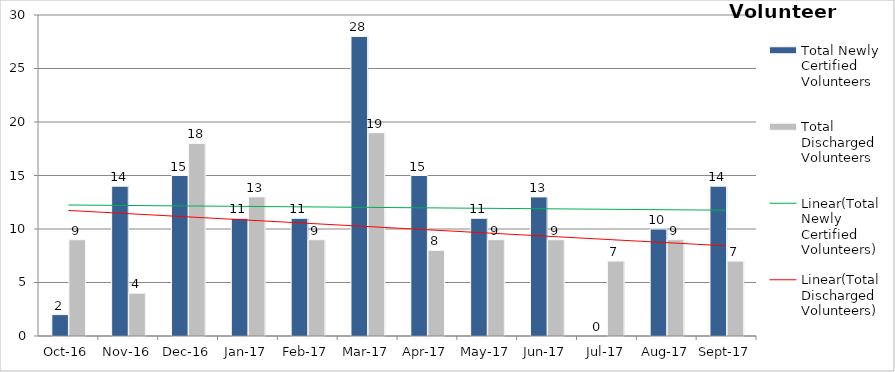
| Category | Total Newly Certified Volunteers | Total Discharged Volunteers |
|---|---|---|
| 2016-10-01 | 2 | 9 |
| 2016-11-01 | 14 | 4 |
| 2016-12-01 | 15 | 18 |
| 2017-01-01 | 11 | 13 |
| 2017-02-01 | 11 | 9 |
| 2017-03-01 | 28 | 19 |
| 2017-04-01 | 15 | 8 |
| 2017-05-01 | 11 | 9 |
| 2017-06-01 | 13 | 9 |
| 2017-07-01 | 0 | 7 |
| 2017-08-01 | 10 | 9 |
| 2017-09-01 | 14 | 7 |